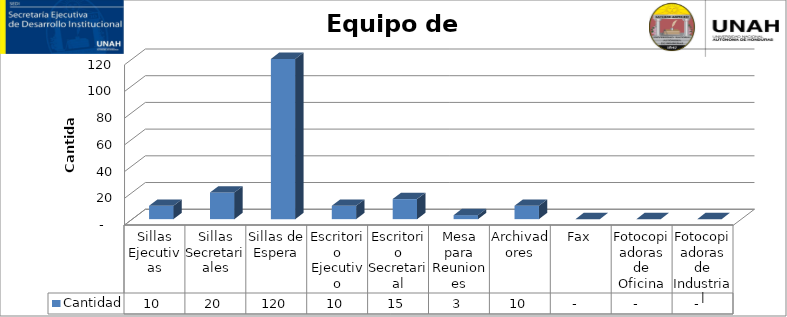
| Category | Cantidad |
|---|---|
| Sillas Ejecutivas | 10 |
| Sillas Secretariales | 20 |
| Sillas de Espera | 120 |
| Escritorio Ejecutivo | 10 |
| Escritorio Secretarial | 15 |
| Mesa para Reuniones | 3 |
| Archivadores | 10 |
| Fax | 0 |
| Fotocopiadoras de Oficina | 0 |
| Fotocopiadoras de Industrial | 0 |